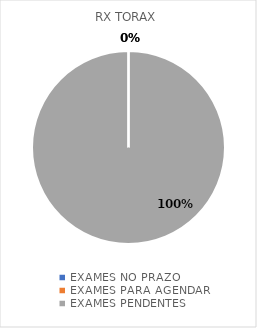
| Category | RX TORAX |
|---|---|
| EXAMES NO PRAZO | 0 |
| EXAMES PARA AGENDAR | 0 |
| EXAMES PENDENTES | 7 |